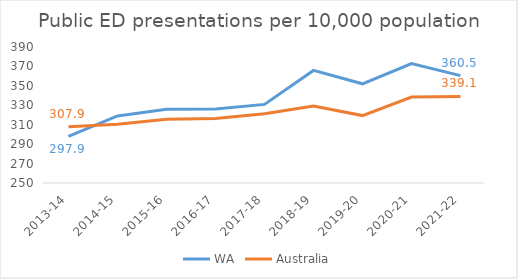
| Category | WA | Australia |
|---|---|---|
| 2013-14 | 297.9 | 307.9 |
| 2014-15 | 319 | 310.4 |
| 2015-16 | 326 | 315.7 |
| 2016-17 | 326.1 | 316.5 |
| 2017-18 | 330.9 | 321.3 |
| 2018-19 | 365.9 | 329.2 |
| 2019-20 | 352.1 | 319.4 |
| 2020-21 | 373 | 338.5 |
| 2021-22 | 360.5 | 339.1 |